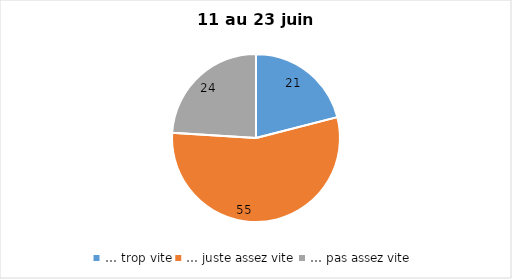
| Category | Series 0 |
|---|---|
| … trop vite | 21 |
| … juste assez vite | 55 |
| … pas assez vite | 24 |